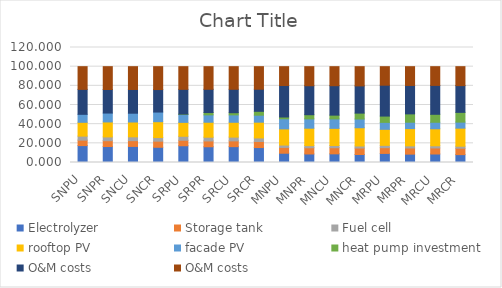
| Category | Electrolyzer | Storage tank | Fuel cell | rooftop PV | facade PV | heat pump investment | O&M costs |
|---|---|---|---|---|---|---|---|
| SNPU | 17.629 | 5.713 | 4.197 | 14.399 | 8.321 | 0 | 23.688 |
| SNPR | 16.655 | 6.086 | 3.965 | 15.605 | 9.279 | 0 | 23.798 |
| SNCU | 16.771 | 6.035 | 3.992 | 15.444 | 9.192 | 0 | 23.782 |
| SNCR | 15.887 | 6.374 | 3.782 | 16.539 | 10.059 | 0 | 23.882 |
| SRPU | 17.475 | 5.74 | 4.16 | 14.496 | 8.173 | 0.476 | 23.655 |
| SRPR | 16.422 | 6.073 | 3.91 | 15.596 | 7.681 | 2.453 | 23.596 |
| SRCU | 16.545 | 6.027 | 3.939 | 15.447 | 7.738 | 2.258 | 23.597 |
| SRCR | 15.598 | 6.326 | 3.713 | 16.438 | 7.296 | 4.034 | 23.544 |
| MNPU | 9.672 | 6.055 | 2.466 | 16.877 | 10.565 | 1.827 | 19.651 |
| MNPR | 8.892 | 6.475 | 2.267 | 18.159 | 9.713 | 4.365 | 19.895 |
| MNCU | 9.041 | 6.386 | 2.306 | 17.887 | 9.876 | 3.921 | 19.841 |
| MNCR | 8.356 | 6.756 | 2.131 | 19.015 | 9.128 | 6.148 | 20.055 |
| MRPU | 9.477 | 6 | 2.417 | 16.731 | 7.246 | 6.571 | 19.335 |
| MRPR | 8.726 | 6.417 | 2.225 | 18.001 | 6.673 | 8.687 | 19.599 |
| MRCU | 8.87 | 6.328 | 2.262 | 17.732 | 6.783 | 8.322 | 19.541 |
| MRCR | 8.21 | 6.696 | 2.094 | 18.851 | 6.278 | 10.183 | 19.774 |